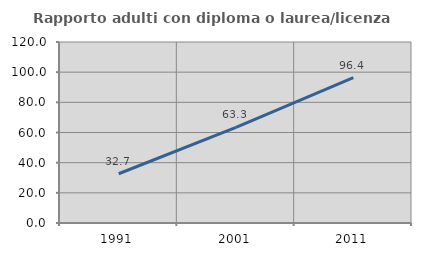
| Category | Rapporto adulti con diploma o laurea/licenza media  |
|---|---|
| 1991.0 | 32.653 |
| 2001.0 | 63.333 |
| 2011.0 | 96.364 |